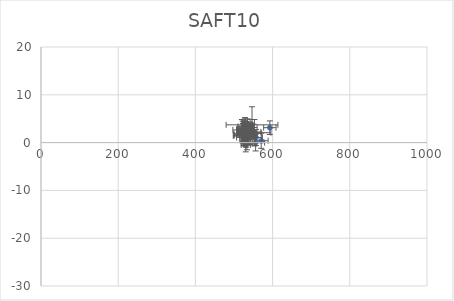
| Category | SAFT10 |
|---|---|
| 556.0572083109777 | -0.008 |
| 541.8151976715855 | 3.16 |
| 528.6765135793361 | 2.104 |
| 534.801489248017 | 2.063 |
| 525.4049405172815 | 2.51 |
| 592.8769641561971 | 3.123 |
| 531.7629290987664 | 1.993 |
| 552.870848781054 | 2.069 |
| 556.7262705465985 | 1.075 |
| 527.8251453131727 | 3.017 |
| 528.5568309117089 | 3.384 |
| 531.0554534378301 | 2.919 |
| 528.1794895775305 | 1.65 |
| 528.7418759869348 | 2.297 |
| 530.6473633451144 | 1.728 |
| 531.047436347309 | 1.061 |
| 520.4025998054342 | 2.659 |
| 532.9935733522373 | 2.232 |
| 523.0034152855421 | 2.409 |
| 522.5146106735249 | 1.647 |
| 570.5256179646474 | 0.386 |
| 526.3548843453386 | 1.929 |
| 527.0560202742105 | 1.597 |
| 541.7103195189515 | 1.063 |
| 529.2548126741241 | 2.935 |
| 528.496854284826 | 1.502 |
| 533.9263447978799 | 1.536 |
| 529.2837129868071 | 1.106 |
| 533.3403273946111 | 1.743 |
| 529.2263413775653 | 1.45 |
| 550.4487655125712 | 2.243 |
| 521.4075145043213 | 1.781 |
| 541.8906244118845 | 1.974 |
| 534.8419099414369 | 3.136 |
| 530.4349048958181 | -0.505 |
| 526.4576217452183 | 2.159 |
| 525.250425701088 | 2.138 |
| 525.2254808879943 | 2.563 |
| 526.7714825307945 | 1.74 |
| 537.7247286078637 | 1.608 |
| 525.618290832744 | 1.372 |
| 537.4781051003112 | 2.552 |
| 532.9433329052679 | 2.107 |
| 526.5409711074038 | 1.957 |
| 546.7048928872912 | 3.718 |
| 533.5201786924263 | -0.129 |
| 522.5907129565733 | 2.8 |
| 528.6060603706015 | 2.768 |